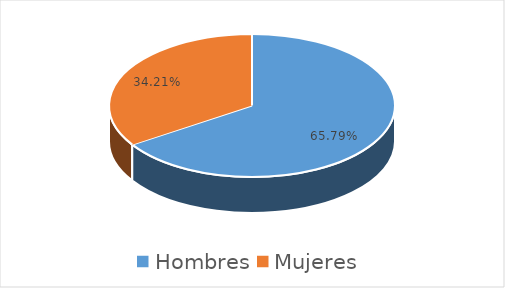
| Category | Series 0 |
|---|---|
| Hombres | 0.658 |
| Mujeres | 0.342 |